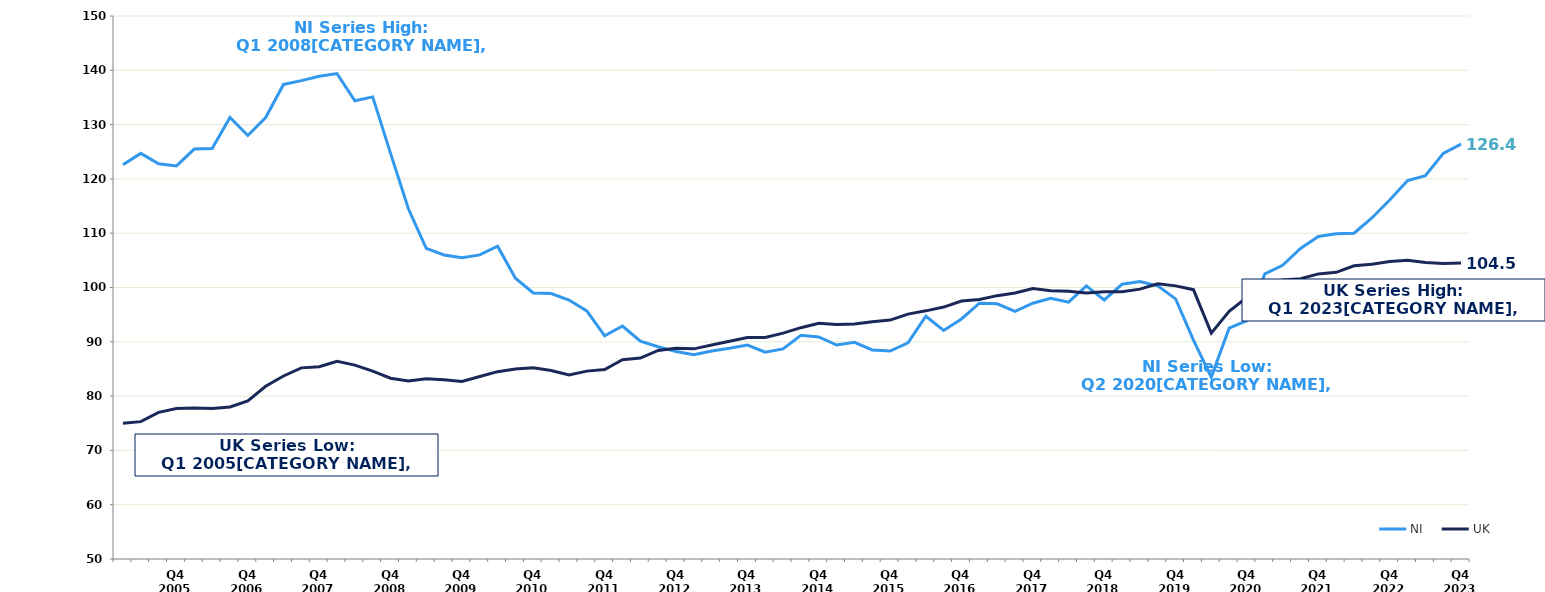
| Category | NI | UK |
|---|---|---|
|  | 122.6 | 75 |
|  | 124.7 | 75.3 |
|  | 122.8 | 77 |
| Q4 2005 | 122.4 | 77.7 |
|  | 125.5 | 77.8 |
|  | 125.6 | 77.7 |
|  | 131.3 | 78 |
| Q4 2006 | 128 | 79.1 |
|  | 131.3 | 81.8 |
|  | 137.4 | 83.7 |
|  | 138.1 | 85.2 |
| Q4 2007 | 138.9 | 85.4 |
|  | 139.4 | 86.4 |
|  | 134.4 | 85.7 |
|  | 135.1 | 84.6 |
| Q4 2008 | 124.7 | 83.3 |
|  | 114.5 | 82.8 |
|  | 107.2 | 83.2 |
|  | 106 | 83 |
| Q4 2009 | 105.5 | 82.7 |
|  | 106 | 83.6 |
|  | 107.6 | 84.5 |
|  | 101.7 | 85 |
| Q4 2010 | 99 | 85.2 |
|  | 98.9 | 84.7 |
|  | 97.7 | 83.9 |
|  | 95.7 | 84.6 |
| Q4 2011 | 91.1 | 84.9 |
|  | 92.9 | 86.7 |
|  | 90.1 | 87 |
|  | 89.1 | 88.4 |
| Q4 2012 | 88.2 | 88.8 |
|  | 87.6 | 88.7 |
|  | 88.3 | 89.4 |
|  | 88.8 | 90.1 |
| Q4 2013 | 89.4 | 90.8 |
|  | 88.1 | 90.8 |
|  | 88.7 | 91.6 |
|  | 91.2 | 92.6 |
| Q4 2014 | 90.9 | 93.4 |
|  | 89.4 | 93.2 |
|  | 89.9 | 93.3 |
|  | 88.5 | 93.7 |
| Q4 2015 | 88.3 | 94 |
|  | 89.8 | 95.1 |
|  | 94.7 | 95.7 |
|  | 92.1 | 96.4 |
| Q4 2016 | 94.2 | 97.5 |
|  | 97.1 | 97.8 |
|  | 97 | 98.5 |
|  | 95.6 | 99 |
| Q4 2017 | 97.1 | 99.8 |
|  | 98 | 99.4 |
|  | 97.3 | 99.3 |
|  | 100.3 | 99 |
| Q4 2018 | 97.7 | 99.2 |
|  | 100.6 | 99.2 |
|  | 101.1 | 99.7 |
|  | 100.3 | 100.7 |
| Q4 2019 | 97.9 | 100.3 |
|  | 90.3 | 99.6 |
|  | 83.5 | 91.6 |
|  | 92.5 | 95.6 |
| Q4 2020 | 93.9 | 98.2 |
|  | 102.5 | 99.7 |
|  | 104.1 | 101.4 |
|  | 107.2 | 101.6 |
| Q4 2021 | 109.4 | 102.5 |
|  | 109.9 | 102.8 |
|  | 110 | 104 |
|  | 112.8 | 104.3 |
| Q4 2022 | 116.1 | 104.8 |
|  | 119.7 | 105 |
|  | 120.6 | 104.6 |
|  | 124.7 | 104.4 |
| Q4 2023 | 126.4 | 104.5 |